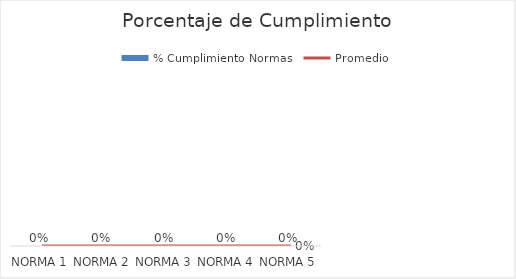
| Category | % Cumplimiento Normas |
|---|---|
| NORMA 1 | 0 |
| NORMA 2 | 0 |
| NORMA 3 | 0 |
| NORMA 4 | 0 |
| NORMA 5 | 0 |